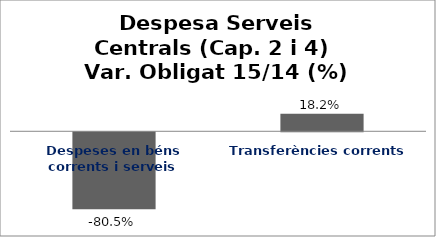
| Category | Series 0 |
|---|---|
| Despeses en béns corrents i serveis | -0.805 |
| Transferències corrents | 0.182 |